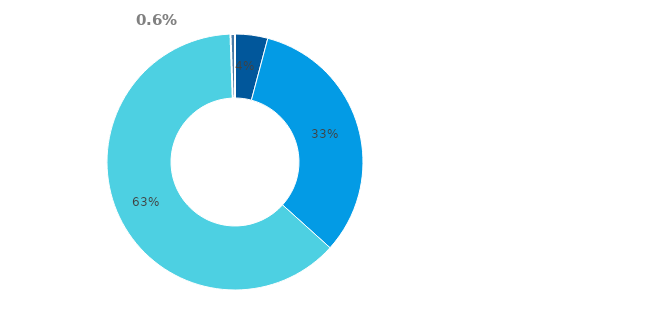
| Category | Series 3 |
|---|---|
| Hotovost | 0.041 |
| Půjčky poskytnuté nemovitostní společnosti | 0.326 |
| Majetkové účasti v nemovitostní společnosti | 0.628 |
| Ostatní finanční aktiva | 0.006 |